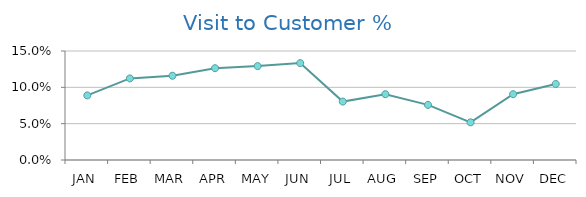
| Category | Visit to Customer % |
|---|---|
| JAN | 0.089 |
| FEB | 0.112 |
| MAR | 0.116 |
| APR | 0.126 |
| MAY | 0.129 |
| JUN | 0.133 |
| JUL | 0.08 |
| AUG | 0.091 |
| SEP | 0.076 |
| OCT | 0.052 |
| NOV | 0.091 |
| DEC | 0.105 |